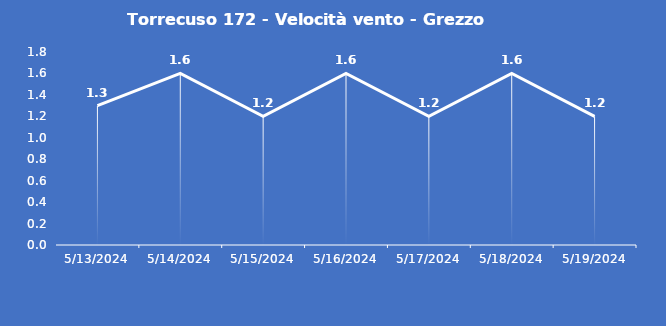
| Category | Torrecuso 172 - Velocità vento - Grezzo (m/s) |
|---|---|
| 5/13/24 | 1.3 |
| 5/14/24 | 1.6 |
| 5/15/24 | 1.2 |
| 5/16/24 | 1.6 |
| 5/17/24 | 1.2 |
| 5/18/24 | 1.6 |
| 5/19/24 | 1.2 |